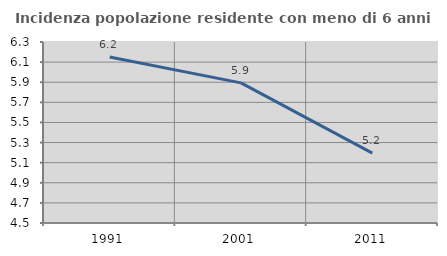
| Category | Incidenza popolazione residente con meno di 6 anni |
|---|---|
| 1991.0 | 6.151 |
| 2001.0 | 5.893 |
| 2011.0 | 5.195 |